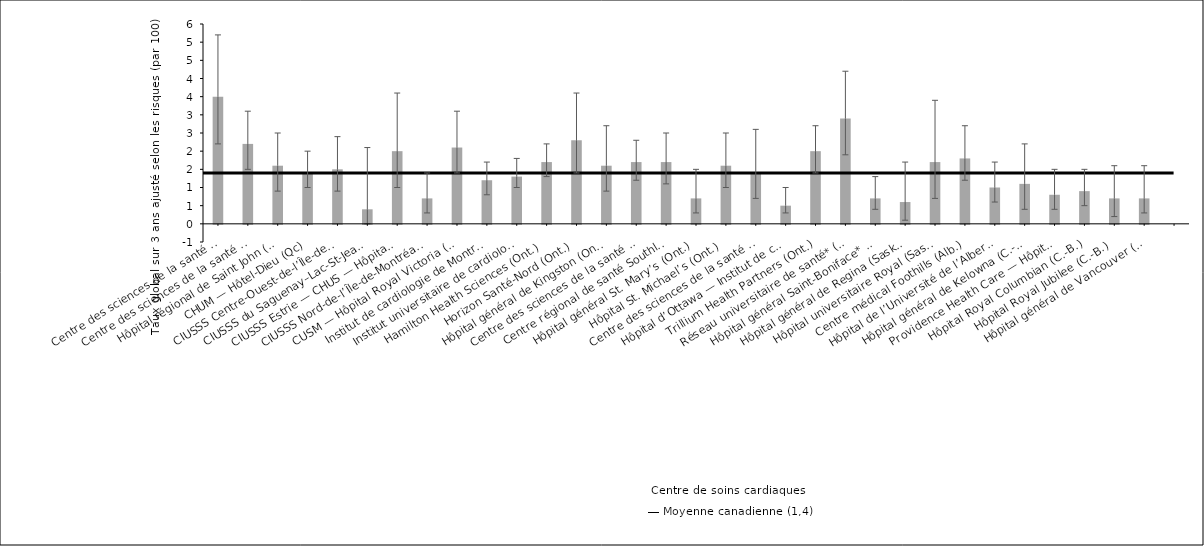
| Category | Taux ajusté selon 
les risques |
|---|---|
| Centre des sciences de la santé — St. John’s* (T.-N.-L.) | 3.5 |
| Centre des sciences de la santé Queen Elizabeth II* (N.-É.) | 2.2 |
| Hôpital régional de Saint John (N.-B.) | 1.6 |
| CHUM — Hôtel-Dieu (Qc) | 1.4 |
| CIUSSS Centre-Ouest-de-l’Île-de-Mtl — Hôpital général juif (Qc) | 1.5 |
| CIUSSS du Saguenay–Lac-St-Jean — Hôpital de Chicoutimi (Qc) | 0.4 |
| CIUSSS Estrie — CHUS — Hôpital Fleurimont (Qc) | 2 |
| CIUSSS Nord-de-l’Île-de-Montréal — Hôpital du Sacré-Cœur de Montréal (Qc) | 0.7 |
| CUSM — Hôpital Royal Victoria (Qc) | 2.1 |
| Institut de cardiologie de Montréal (Qc) | 1.2 |
| Institut universitaire de cardiologie et pneumologie de Québec (Qc) | 1.3 |
| Hamilton Health Sciences (Ont.) | 1.7 |
| Horizon Santé-Nord (Ont.) | 2.3 |
| Hôpital général de Kingston (Ont.) | 1.6 |
| Centre des sciences de la santé de London (Ont.) | 1.7 |
| Centre régional de santé Southlake (Ont.) | 1.7 |
| Hôpital général St. Mary’s (Ont.) | 0.7 |
| Hôpital St. Michael’s (Ont.) | 1.6 |
| Centre des sciences de la santé Sunnybrook (Ont.) | 1.4 |
| Hôpital d’Ottawa — Institut de cardiologie de l’Université d’Ottawa* (Ont.) | 0.5 |
| Trillium Health Partners (Ont.) | 2 |
| Réseau universitaire de santé* (Ont.) | 2.9 |
| Hôpital général Saint-Boniface* (Man.) | 0.7 |
| Hôpital général de Regina (Sask.) | 0.6 |
| Hôpital universitaire Royal (Sask.) | 1.7 |
| Centre médical Foothills (Alb.) | 1.8 |
| Hôpital de l’Université de l’Alberta (Alb.) | 1 |
| Hôpital général de Kelowna (C.-B.) | 1.1 |
| Providence Health Care — Hôpital St. Paul’s (Vancouver) (C.-B.) | 0.8 |
| Hôpital Royal Columbian (C.-B.) | 0.9 |
| Hôpital Royal Jubilee (C.-B.) | 0.7 |
| Hôpital général de Vancouver (C.-B.) | 0.7 |